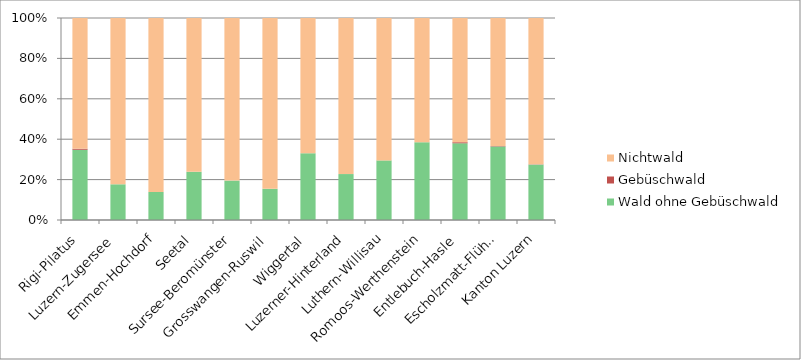
| Category | Wald ohne Gebüschwald | Gebüschwald | Nichtwald |
|---|---|---|---|
| Rigi-Pilatus | 5490.1 | 75.6 | 10224.7 |
| Luzern-Zugersee | 1803.1 | 0 | 8398 |
| Emmen-Hochdorf | 1882.9 | 0 | 11699.1 |
| Seetal | 1316.3 | 0 | 4197.1 |
| Sursee-Beromünster | 2533.6 | 0 | 10460.6 |
| Grosswangen-Ruswil | 2369.4 | 0 | 12982.5 |
| Wiggertal | 2826.7 | 0 | 5729.1 |
| Luzerner-Hinterland | 2187.7 | 0 | 7433.1 |
| Luthern-Willisau | 3614.1 | 0 | 8633.7 |
| Romoos-Werthenstein | 4031.4 | 0 | 6445.3 |
| Entlebuch-Hasle | 3692.4 | 50.2 | 5978.2 |
| Escholzmatt-Flühli | 9204.6 | 49.9 | 16039.5 |
| Kanton Luzern | 40952.4 | 175.7 | 108221.1 |